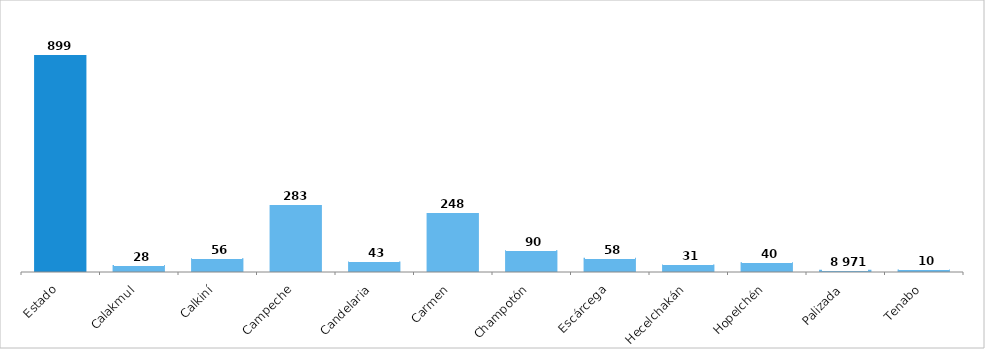
| Category | Población total |
|---|---|
| Estado | 899931 |
| Calakmul | 28424 |
| Calkiní | 56537 |
| Campeche | 283025 |
| Candelaria | 43879 |
| Carmen | 248303 |
| Champotón | 90244 |
| Escárcega | 58553 |
| Hecelchakán | 31230 |
| Hopelchén | 40100 |
| Palizada | 8971 |
| Tenabo | 10665 |